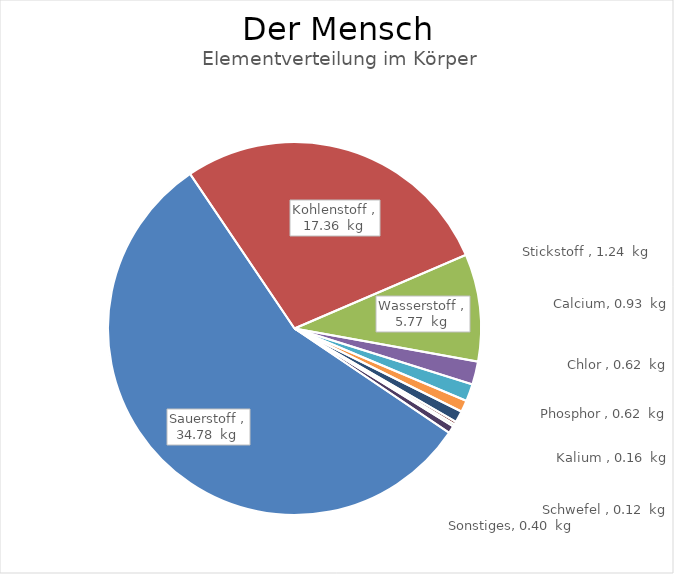
| Category | Masse |
|---|---|
| Sauerstoff  | 34.782 |
| Kohlenstoff  | 17.36 |
| Wasserstoff  | 5.766 |
| Stickstoff  | 1.24 |
| Calcium | 0.93 |
| Chlor  | 0.62 |
| Phosphor  | 0.62 |
| Kalium  | 0.155 |
| Schwefel  | 0.124 |
| Sonstiges | 0.403 |